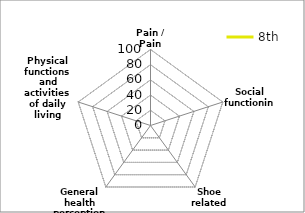
| Category | 8th |
|---|---|
| Pain / Pain related | 0 |
| Social functioning | 0 |
| Shoe related | 0 |
| General health perceptions | 0 |
| Physical functions and activities of daily living (ADL) | 0 |